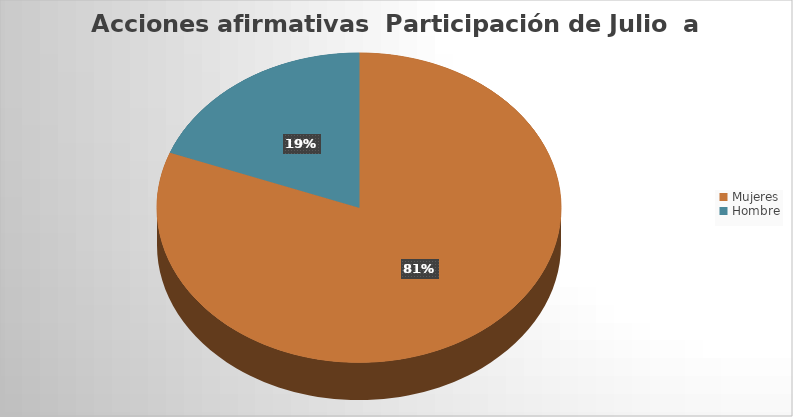
| Category | Series 0 |
|---|---|
| Mujeres  | 84 |
| Hombre  | 20 |